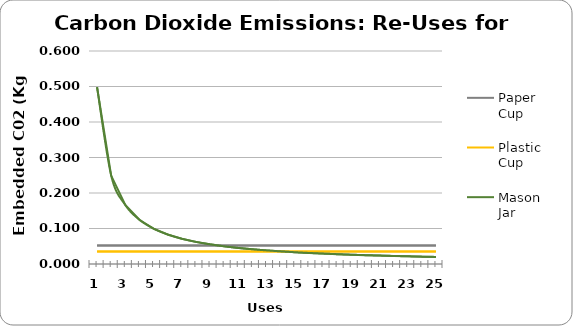
| Category | Paper Cup | Plastic Cup | Mason Jar |
|---|---|---|---|
| 0 | 0.052 | 0.035 | 0.498 |
| 1 | 0.052 | 0.035 | 0.249 |
| 2 | 0.052 | 0.035 | 0.166 |
| 3 | 0.052 | 0.035 | 0.125 |
| 4 | 0.052 | 0.035 | 0.1 |
| 5 | 0.052 | 0.035 | 0.083 |
| 6 | 0.052 | 0.035 | 0.071 |
| 7 | 0.052 | 0.035 | 0.062 |
| 8 | 0.052 | 0.035 | 0.055 |
| 9 | 0.052 | 0.035 | 0.05 |
| 10 | 0.052 | 0.035 | 0.045 |
| 11 | 0.052 | 0.035 | 0.042 |
| 12 | 0.052 | 0.035 | 0.038 |
| 13 | 0.052 | 0.035 | 0.036 |
| 14 | 0.052 | 0.035 | 0.033 |
| 15 | 0.052 | 0.035 | 0.031 |
| 16 | 0.052 | 0.035 | 0.029 |
| 17 | 0.052 | 0.035 | 0.028 |
| 18 | 0.052 | 0.035 | 0.026 |
| 19 | 0.052 | 0.035 | 0.025 |
| 20 | 0.052 | 0.035 | 0.024 |
| 21 | 0.052 | 0.035 | 0.023 |
| 22 | 0.052 | 0.035 | 0.022 |
| 23 | 0.052 | 0.035 | 0.021 |
| 24 | 0.052 | 0.035 | 0.02 |